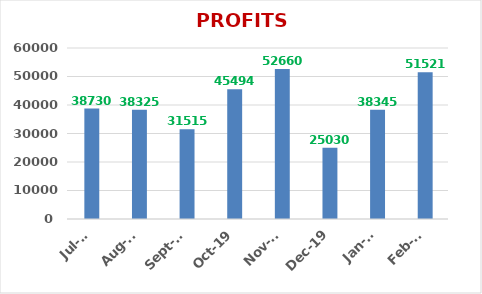
| Category | PROFITS (Rs.) |
|---|---|
| 2020-02-01 | 51521 |
| 2020-01-01 | 38345 |
| 2019-12-01 | 25030 |
| 2019-11-01 | 52660 |
| 2019-10-01 | 45494 |
| 2019-09-01 | 31515 |
| 2019-08-01 | 38325 |
| 2019-07-01 | 38730 |